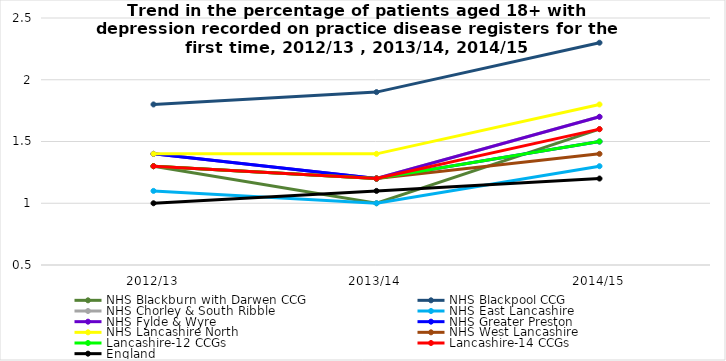
| Category | NHS Blackburn with Darwen CCG  | NHS Blackpool CCG | NHS Chorley & South Ribble | NHS East Lancashire | NHS Fylde & Wyre | NHS Greater Preston | NHS Lancashire North | NHS West Lancashire | Lancashire-12 CCGs | Lancashire-14 CCGs | England |
|---|---|---|---|---|---|---|---|---|---|---|---|
| 2012/13 | 1.3 | 1.8 | 1.3 | 1.1 | 1.4 | 1.4 | 1.4 | 1.3 | 1.3 | 1.3 | 1 |
| 2013/14 | 1 | 1.9 | 1.2 | 1 | 1.2 | 1.2 | 1.4 | 1.2 | 1.2 | 1.2 | 1.1 |
| 2014/15 | 1.6 | 2.3 | 1.7 | 1.3 | 1.7 | 1.5 | 1.8 | 1.4 | 1.5 | 1.6 | 1.2 |